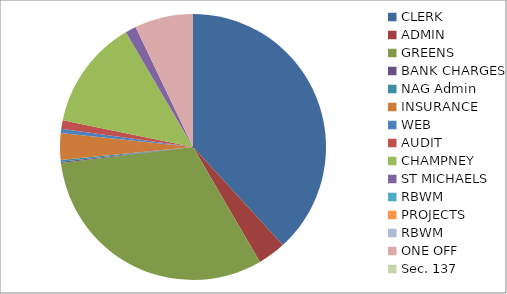
| Category | Series 0 |
|---|---|
| CLERK | 17462.53 |
| ADMIN | 1553.32 |
| GREENS | 14381.71 |
| BANK CHARGES | 72 |
| NAG Admin | 99.64 |
| INSURANCE | 1473.22 |
| WEB | 240.99 |
| AUDIT | 470 |
| CHAMPNEY | 6108 |
| ST MICHAELS | 601 |
| RBWM | 0 |
| PROJECTS | 0 |
| RBWM | 0 |
| ONE OFF | 3245.24 |
| Sec. 137 | 0 |